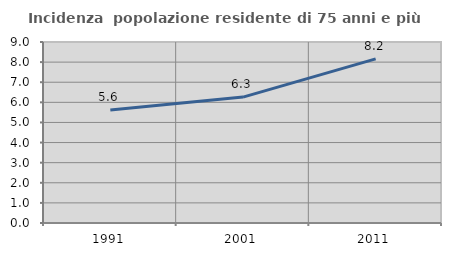
| Category | Incidenza  popolazione residente di 75 anni e più |
|---|---|
| 1991.0 | 5.617 |
| 2001.0 | 6.26 |
| 2011.0 | 8.162 |